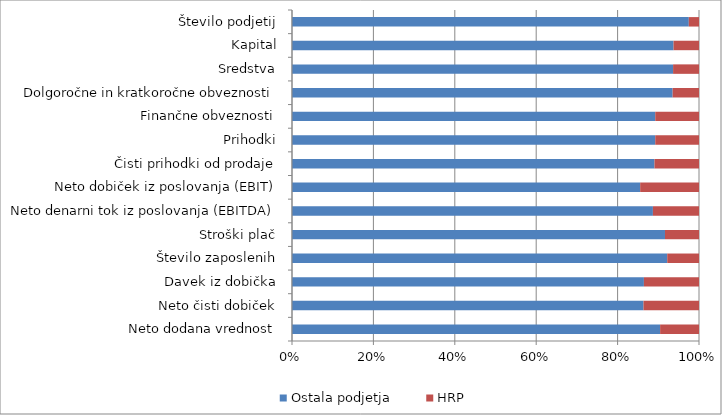
| Category | Ostala podjetja | HRP |
|---|---|---|
| Neto dodana vrednost | 30278172.442 | 3197252.44 |
| Neto čisti dobiček | 6295034.162 | 994454.622 |
| Davek iz dobička | 1133978.123 | 177490.48 |
| Število zaposlenih | 554083.14 | 46917.68 |
| Stroški plač | 13172411.736 | 1200950.962 |
| Neto denarni tok iz poslovanja (EBITDA) | 12228145.145 | 1561397.474 |
| Neto dobiček iz poslovanja (EBIT) | 6915226.542 | 1168246.024 |
| Čisti prihodki od prodaje | 140362430.978 | 17242443.325 |
| Prihodki | 146186721.071 | 17604248.729 |
| Finančne obveznosti | 146186721.071 | 17604248.729 |
| Dolgoročne in kratkoročne obveznosti | 62976250.839 | 4361848.273 |
| Sredstva | 125411030.001 | 8529358.648 |
| Kapital | 62434421.065 | 4167510.375 |
| Število podjetij | 119710 | 3074 |